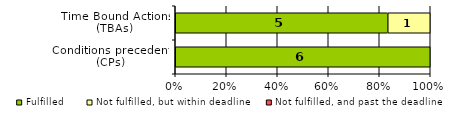
| Category | Fulfilled | Not fulfilled, but within deadline | Not fulfilled, and past the deadline |
|---|---|---|---|
| Conditions precedent (CPs) | 6 | 0 | 0 |
| Time Bound Actions (TBAs) | 5 | 1 | 0 |